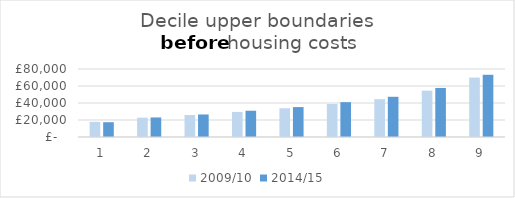
| Category | 2009/10 | 2014/15 |
|---|---|---|
| 0 | 17800 | 17400 |
| 1 | 22700 | 23000 |
| 2 | 25900 | 26500 |
| 3 | 29500 | 30900 |
| 4 | 33800 | 35200 |
| 5 | 38800 | 41000 |
| 6 | 44500 | 47300 |
| 7 | 54500 | 57700 |
| 8 | 69900 | 73200 |